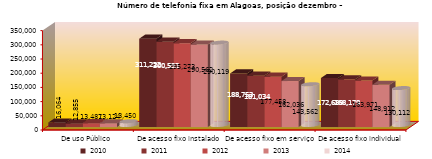
| Category | 2010 | 2011 | 2012 | 2013 | 2014 |
|---|---|---|---|---|---|
| De uso Público  | 16064 | 12855 | 13487 | 13124 | 13450 |
| De acesso fixo instalado | 311222 | 300593 | 295273 | 290562 | 290119 |
| De acesso fixo em serviço | 188753 | 181034 | 177458 | 162036 | 143562 |
| De acesso fixo individual | 172689 | 168179 | 163971 | 148912 | 130112 |